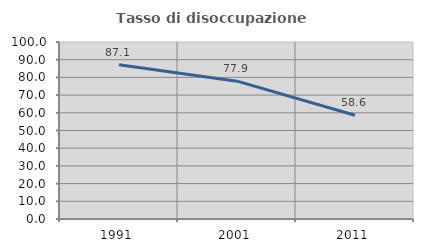
| Category | Tasso di disoccupazione giovanile  |
|---|---|
| 1991.0 | 87.114 |
| 2001.0 | 77.88 |
| 2011.0 | 58.638 |